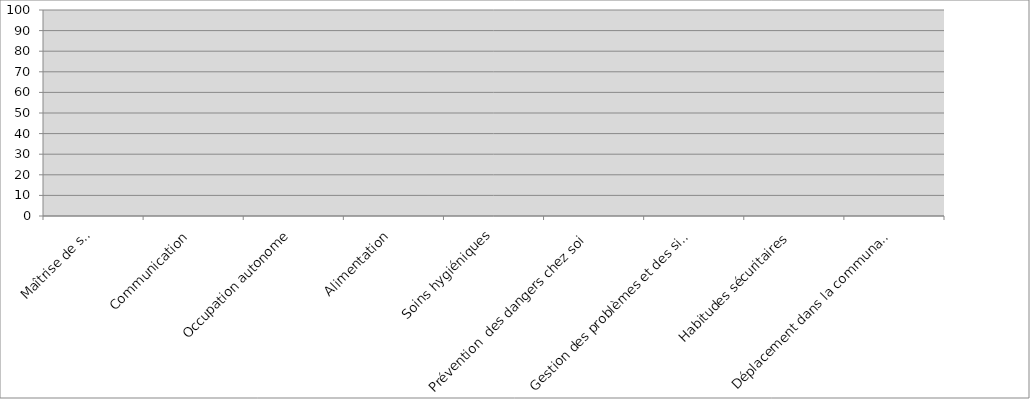
| Category | Series 2 |
|---|---|
| Maîtrise de soi | 0 |
| Communication | 0 |
| Occupation autonome | 0 |
| Alimentation | 0 |
| Soins hygiéniques | 0 |
| Prévention  des dangers chez soi | 0 |
| Gestion des problèmes et des situations  urgentes | 0 |
| Habitudes sécuritaires | 0 |
| Déplacement dans la communauté | 0 |